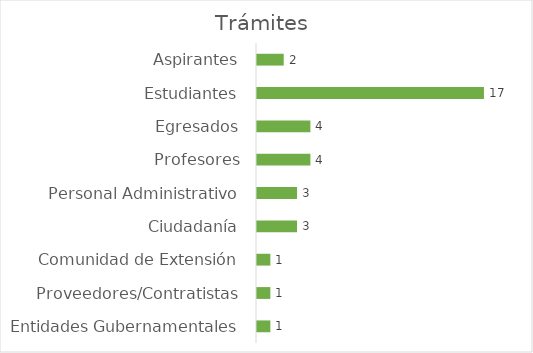
| Category | Trámites |
|---|---|
| Aspirantes | 2 |
| Estudiantes | 17 |
| Egresados | 4 |
| Profesores | 4 |
| Personal Administrativo | 3 |
| Ciudadanía | 3 |
| Comunidad de Extensión | 1 |
| Proveedores/Contratistas | 1 |
| Entidades Gubernamentales | 1 |